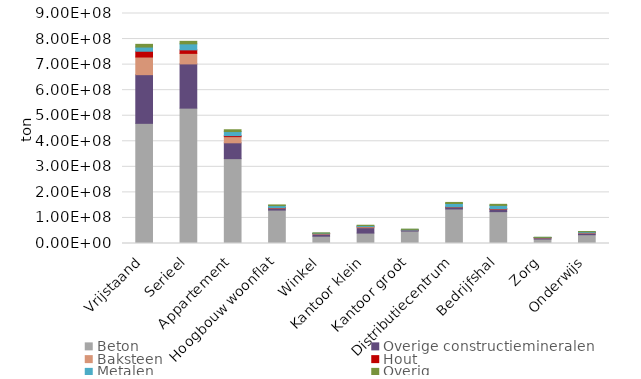
| Category | Beton | Overige constructiemineralen | Baksteen | Hout | Metalen | Overig |
|---|---|---|---|---|---|---|
| Vrijstaand | 470184681.355 | 190463974.538 | 69044433.997 | 22614354.694 | 16458221.833 | 10554271.872 |
| Serieel | 529686338.539 | 173035924.181 | 41223627.728 | 13776242.371 | 23537976.066 | 9788933.757 |
| Appartement | 332075735.766 | 61947631.414 | 24127335.656 | 3889125.378 | 16032356.33 | 6978979.608 |
| Hoogbouw woonflat | 130855952.402 | 7806320.981 | 1021423.796 | 925197.247 | 7719670.251 | 2650497.035 |
| Winkel | 28588759.678 | 8304652.438 | 2071066.224 | 352340.027 | 1187307.787 | 967337.528 |
| Kantoor klein | 40838335.826 | 20978314.528 | 3753641.133 | 385574.869 | 4072210.08 | 1421840.266 |
| Kantoor groot | 48774985.548 | 2811444.935 | 341847.285 | 352611.762 | 2883867.316 | 985991.926 |
| Distributiecentrum | 135144991.126 | 5909715.753 | 674311.683 | 1287465.811 | 13384635.131 | 4277311.298 |
| Bedrijfshal | 124653132.912 | 9463069.75 | 897047.173 | 1349237.792 | 12661829.179 | 4269711.912 |
| Zorg | 17517644.62 | 4422688.54 | 1021994.976 | 157697.851 | 816466.918 | 374641.557 |
| Onderwijs | 34357425.918 | 6494999.075 | 1949048.812 | 467334.483 | 2686161.509 | 744350.712 |